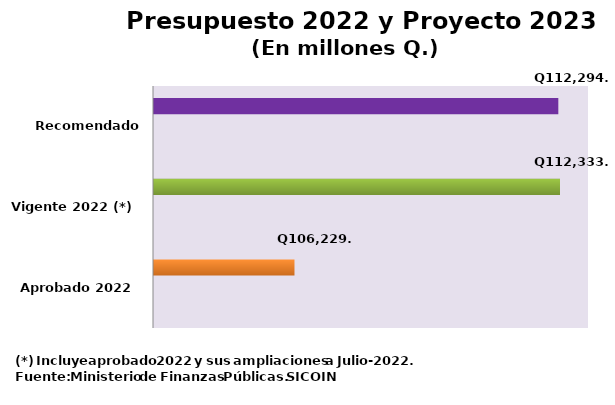
| Category | Series 0 | Series 2 | Series 3 |
|---|---|---|---|
| Aprobado 2022 |  |  | 106229.5 |
| Vigente 2022 (*) |  |  | 112333.3 |
| Recomendado 2023 |  |  | 112294.8 |